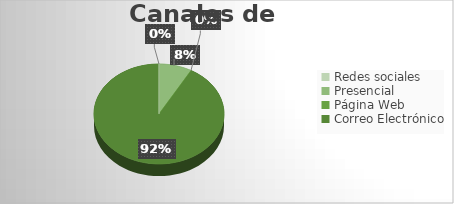
| Category | Canales de atención |
|---|---|
| Redes sociales | 0 |
| Presencial | 121 |
| Página Web | 1 |
| Correo Electrónico | 1361 |